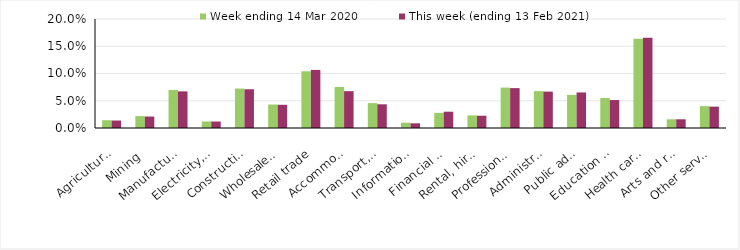
| Category | Week ending 14 Mar 2020 | This week (ending 13 Feb 2021) |
|---|---|---|
| Agriculture, forestry and fishing | 0.014 | 0.014 |
| Mining | 0.022 | 0.021 |
| Manufacturing | 0.07 | 0.067 |
| Electricity, gas, water and waste services | 0.012 | 0.012 |
| Construction | 0.072 | 0.071 |
| Wholesale trade | 0.043 | 0.043 |
| Retail trade | 0.104 | 0.107 |
| Accommodation and food services | 0.075 | 0.068 |
| Transport, postal and warehousing | 0.046 | 0.044 |
| Information media and telecommunications | 0.01 | 0.009 |
| Financial and insurance services | 0.028 | 0.03 |
| Rental, hiring and real estate services | 0.023 | 0.022 |
| Professional, scientific and technical services | 0.074 | 0.073 |
| Administrative and support services | 0.068 | 0.067 |
| Public administration and safety | 0.061 | 0.065 |
| Education and training | 0.055 | 0.051 |
| Health care and social assistance | 0.164 | 0.165 |
| Arts and recreation services | 0.016 | 0.016 |
| Other services | 0.04 | 0.039 |